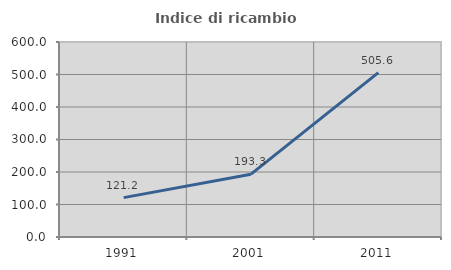
| Category | Indice di ricambio occupazionale  |
|---|---|
| 1991.0 | 121.154 |
| 2001.0 | 193.333 |
| 2011.0 | 505.556 |